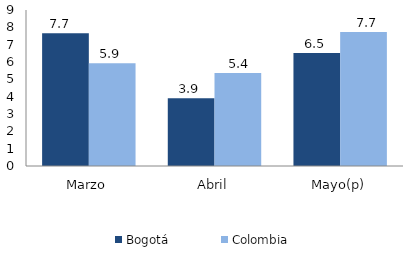
| Category | Bogotá | Colombia |
|---|---|---|
| Marzo | 7.662 | 5.933 |
| Abril | 3.905 | 5.365 |
| Mayo(p) | 6.522 | 7.736 |